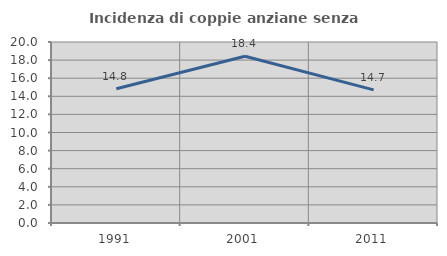
| Category | Incidenza di coppie anziane senza figli  |
|---|---|
| 1991.0 | 14.833 |
| 2001.0 | 18.425 |
| 2011.0 | 14.711 |